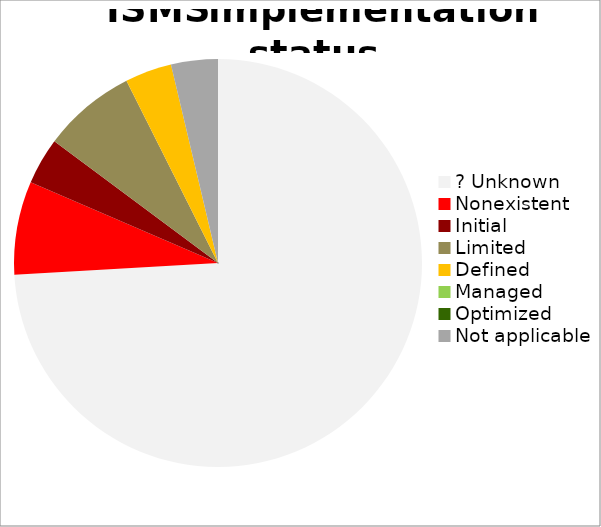
| Category | Series 0 |
|---|---|
| ? Unknown | 0.741 |
| Nonexistent | 0.074 |
| Initial | 0.037 |
| Limited | 0.074 |
| Defined | 0.037 |
| Managed | 0 |
| Optimized | 0 |
| Not applicable | 0.037 |